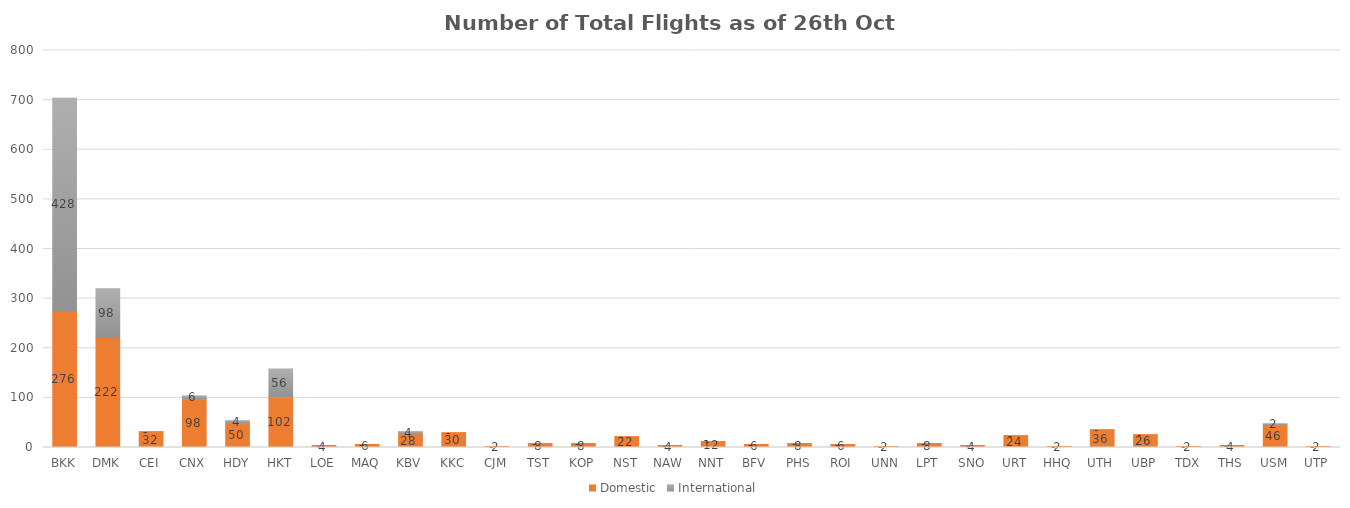
| Category | Domestic | International |
|---|---|---|
| BKK | 276 | 428 |
| DMK | 222 | 98 |
| CEI | 32 | 0 |
| CNX | 98 | 6 |
| HDY | 50 | 4 |
| HKT | 102 | 56 |
| LOE | 4 | 0 |
| MAQ | 6 | 0 |
| KBV | 28 | 4 |
| KKC | 30 | 0 |
| CJM | 2 | 0 |
| TST | 8 | 0 |
| KOP | 8 | 0 |
| NST | 22 | 0 |
| NAW | 4 | 0 |
| NNT | 12 | 0 |
| BFV | 6 | 0 |
| PHS | 8 | 0 |
| ROI | 6 | 0 |
| UNN | 2 | 0 |
| LPT | 8 | 0 |
| SNO | 4 | 0 |
| URT | 24 | 0 |
| HHQ | 2 | 0 |
| UTH | 36 | 0 |
| UBP | 26 | 0 |
| TDX | 2 | 0 |
| THS | 4 | 0 |
| USM | 46 | 2 |
| UTP | 2 | 0 |